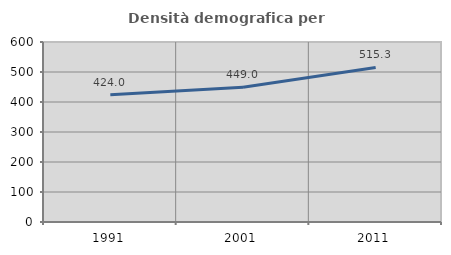
| Category | Densità demografica |
|---|---|
| 1991.0 | 424.022 |
| 2001.0 | 449.01 |
| 2011.0 | 515.302 |